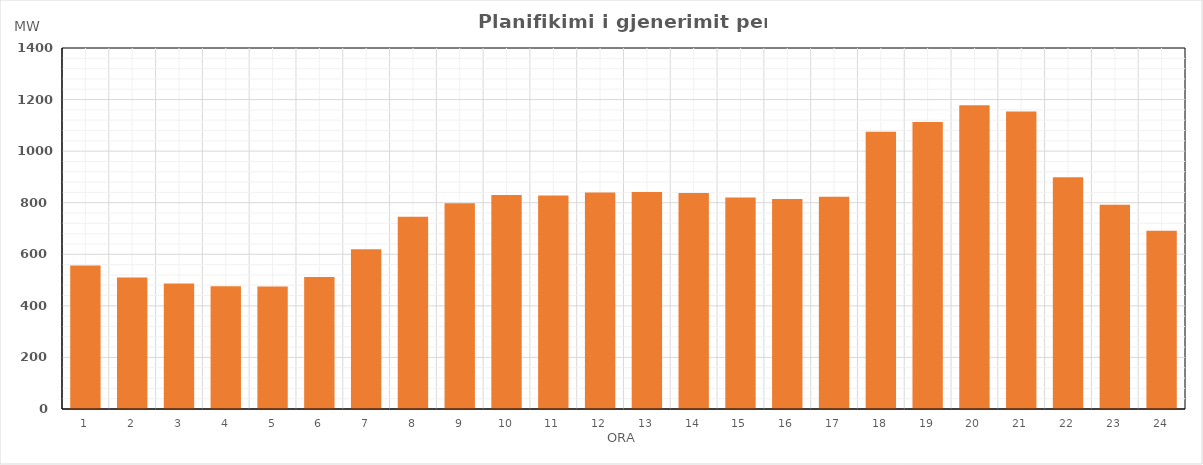
| Category | Max (MW) |
|---|---|
| 0 | 556.65 |
| 1 | 509.77 |
| 2 | 487.15 |
| 3 | 476.4 |
| 4 | 475.45 |
| 5 | 511.65 |
| 6 | 619.72 |
| 7 | 746.03 |
| 8 | 798.35 |
| 9 | 829.65 |
| 10 | 827.94 |
| 11 | 839.25 |
| 12 | 841.12 |
| 13 | 837.34 |
| 14 | 820.26 |
| 15 | 814.74 |
| 16 | 823.61 |
| 17 | 1075.03 |
| 18 | 1112.69 |
| 19 | 1177.75 |
| 20 | 1154.18 |
| 21 | 898.85 |
| 22 | 792.01 |
| 23 | 691.43 |